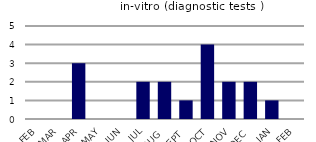
| Category | in-vitro (diagnostic tests ) |
|---|---|
| FEB | 0 |
| MAR | 0 |
| APR | 3 |
| MAY | 0 |
| JUN | 0 |
| JUL | 2 |
| AUG | 2 |
| SEPT | 1 |
| OCT | 4 |
| NOV | 2 |
| DEC | 2 |
| JAN | 1 |
| FEB | 0 |